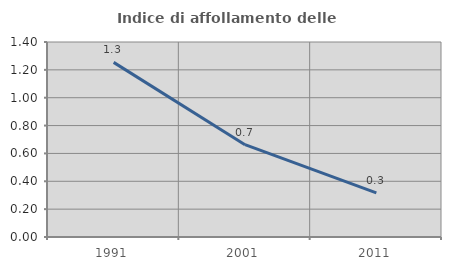
| Category | Indice di affollamento delle abitazioni  |
|---|---|
| 1991.0 | 1.254 |
| 2001.0 | 0.663 |
| 2011.0 | 0.317 |